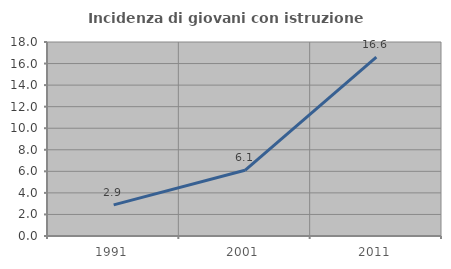
| Category | Incidenza di giovani con istruzione universitaria |
|---|---|
| 1991.0 | 2.888 |
| 2001.0 | 6.098 |
| 2011.0 | 16.605 |